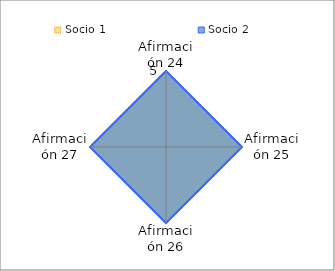
| Category | Socio 1 | Socio 2 |
|---|---|---|
| Afirmación 24 | 5 | 5 |
| Afirmación 25 | 5 | 5 |
| Afirmación 26 | 5 | 5 |
| Afirmación 27 | 5 | 5 |